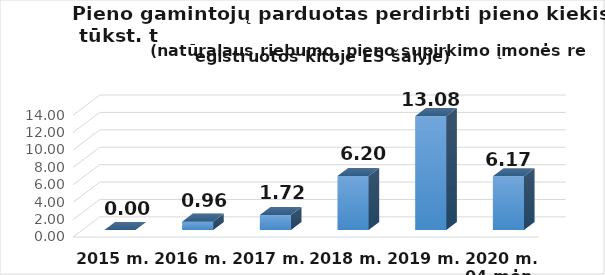
| Category | Kitoje ES šalyje registruotam ūkio subjektui  |
|---|---|
| 2015 m. | 0 |
| 2016 m. | 0.96 |
| 2017 m.  | 1.72 |
| 2018 m.  | 6.2 |
| 2019 m.  | 13.08 |
| 2020 m. 04 mėn. | 6.17 |